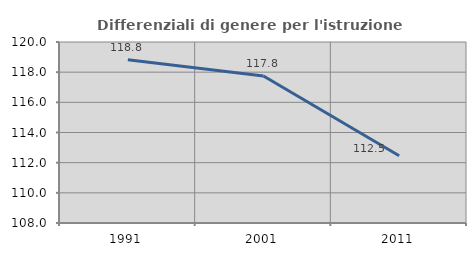
| Category | Differenziali di genere per l'istruzione superiore |
|---|---|
| 1991.0 | 118.816 |
| 2001.0 | 117.751 |
| 2011.0 | 112.462 |